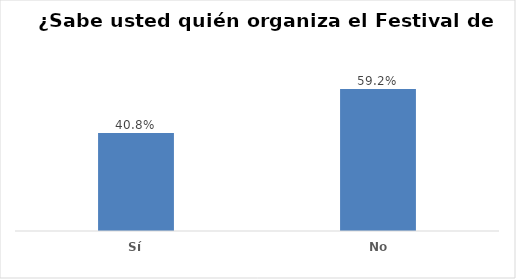
| Category | Series 0 |
|---|---|
| Sí | 0.408 |
| No | 0.592 |